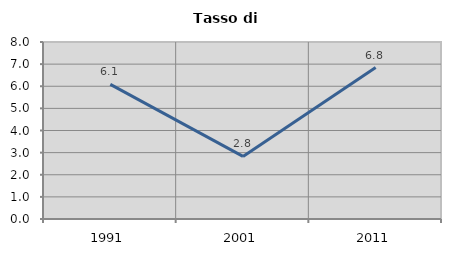
| Category | Tasso di disoccupazione   |
|---|---|
| 1991.0 | 6.085 |
| 2001.0 | 2.828 |
| 2011.0 | 6.842 |